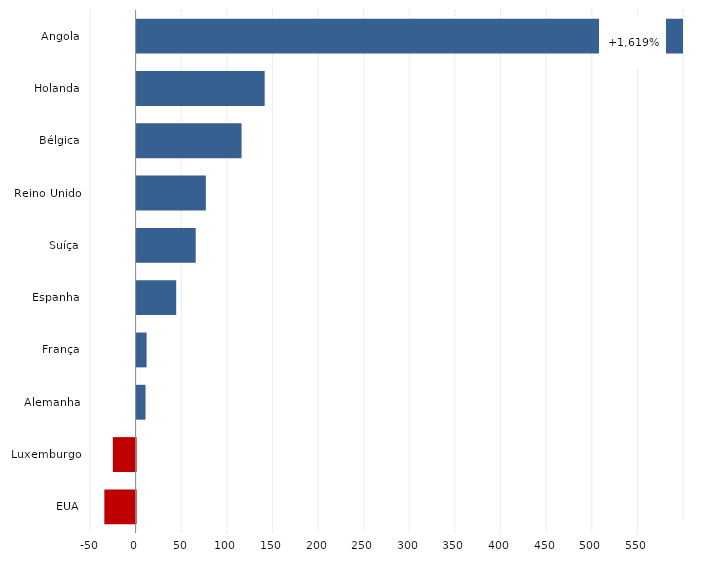
| Category | Series 0 |
|---|---|
| Angola | 750 |
| Holanda | 140.378 |
| Bélgica | 115.042 |
| Reino Unido | 75.926 |
| Suíça | 64.787 |
| Espanha | 43.4 |
| França | 10.925 |
| Alemanha | 9.747 |
| Luxemburgo | -24.947 |
| EUA | -34.289 |